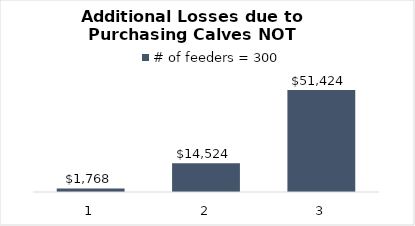
| Category | # of feeders = 300 |
|---|---|
| 0 | 1768.22 |
| 1 | 14523.8 |
| 2 | 51423.86 |